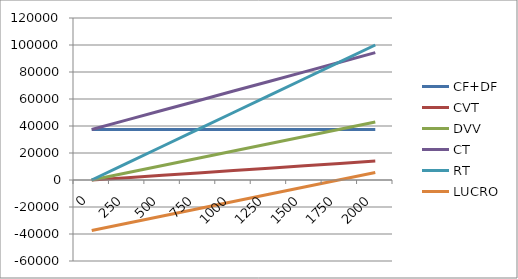
| Category | CF+DF | CVT | DVV | CT | RT | LUCRO |
|---|---|---|---|---|---|---|
| 0.0 | 37376 | 0 | 0 | 37376 | 0 | -37376 |
| 250.0 | 37376 | 1750 | 5375 | 44501 | 12500 | -32001 |
| 500.0 | 37376 | 3500 | 10750 | 51626 | 25000 | -26626 |
| 750.0 | 37376 | 5250 | 16125 | 58751 | 37500 | -21251 |
| 1000.0 | 37376 | 7000 | 21500 | 65876 | 50000 | -15876 |
| 1250.0 | 37376 | 8750 | 26875 | 73001 | 62500 | -10501 |
| 1500.0 | 37376 | 10500 | 32250 | 80126 | 75000 | -5126 |
| 1750.0 | 37376 | 12250 | 37625 | 87251 | 87500 | 249 |
| 2000.0 | 37376 | 14000 | 43000 | 94376 | 100000 | 5624 |